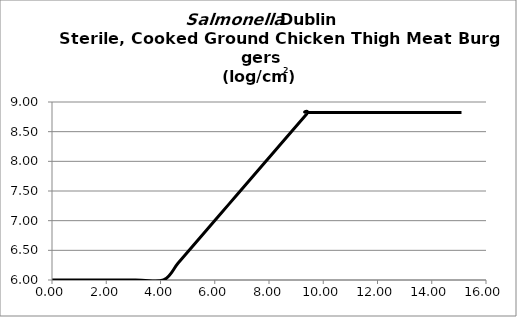
| Category | log/cm2 |
|---|---|
| 0.0 | 6 |
| 1.027981500546596 | 6 |
| 3.083944501639788 | 6 |
| 4.111926002186384 | 6 |
| 4.644276131067741 | 6.282 |
| 5.176626259949099 | 6.565 |
| 5.708976388830457 | 6.847 |
| 6.241326517711815 | 7.129 |
| 6.773676646593172 | 7.411 |
| 7.30602677547453 | 7.694 |
| 7.838376904355887 | 7.976 |
| 8.370727033237245 | 8.258 |
| 9.382192278111825 | 8.795 |
| 9.43542729099996 | 8.823 |
| 11.322512749199953 | 8.823 |
| 13.209598207399944 | 8.823 |
| 15.096683665599938 | 8.823 |